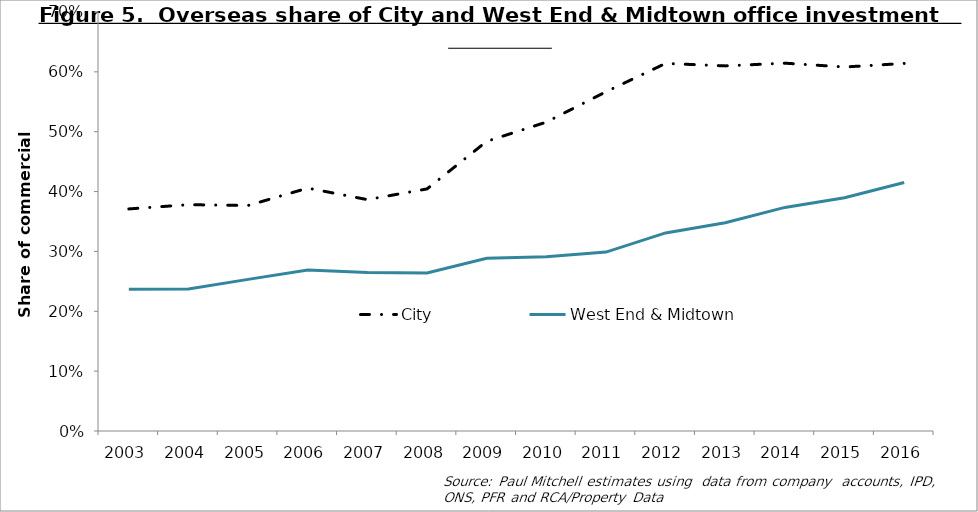
| Category | City | West End & Midtown |
|---|---|---|
| 2003.0 | 0.371 | 0.237 |
| 2004.0 | 0.378 | 0.237 |
| 2005.0 | 0.377 | 0.253 |
| 2006.0 | 0.406 | 0.269 |
| 2007.0 | 0.387 | 0.265 |
| 2008.0 | 0.404 | 0.264 |
| 2009.0 | 0.484 | 0.289 |
| 2010.0 | 0.516 | 0.291 |
| 2011.0 | 0.567 | 0.299 |
| 2012.0 | 0.614 | 0.331 |
| 2013.0 | 0.61 | 0.348 |
| 2014.0 | 0.615 | 0.374 |
| 2015.0 | 0.608 | 0.39 |
| 2016.0 | 0.614 | 0.415 |